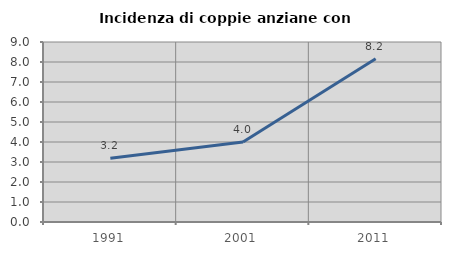
| Category | Incidenza di coppie anziane con figli |
|---|---|
| 1991.0 | 3.191 |
| 2001.0 | 4 |
| 2011.0 | 8.163 |